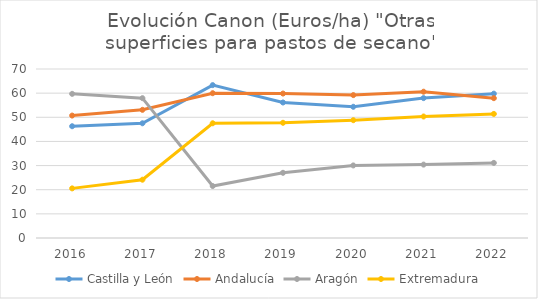
| Category | Castilla y León | Andalucía | Aragón | Extremadura |
|---|---|---|---|---|
| 2016.0 | 46.296 | 50.709 | 59.707 | 20.551 |
| 2017.0 | 47.517 | 53.087 | 57.913 | 24.143 |
| 2018.0 | 63.324 | 59.973 | 21.523 | 47.523 |
| 2019.0 | 56.131 | 59.831 | 27.007 | 47.729 |
| 2020.0 | 54.35 | 59.188 | 30.055 | 48.794 |
| 2021.0 | 57.949 | 60.596 | 30.399 | 50.327 |
| 2022.0 | 59.782 | 57.924 | 31.104 | 51.393 |